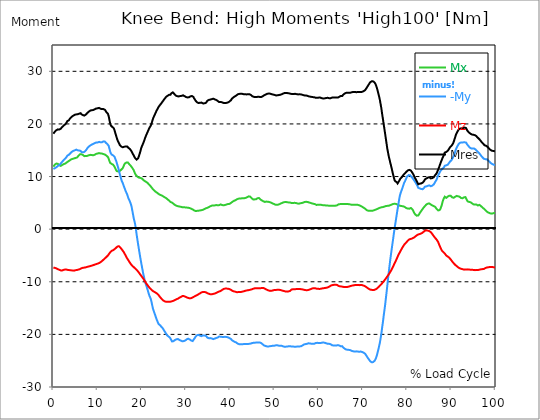
| Category |  Mx |  -My |  Mz |  Mres |
|---|---|---|---|---|
| 0.0 | 11.876 | 11.443 | -7.324 | 18.142 |
| 0.167348456675344 | 12.068 | 11.507 | -7.34 | 18.334 |
| 0.334696913350688 | 12.26 | 11.587 | -7.356 | 18.527 |
| 0.5020453700260321 | 12.389 | 11.667 | -7.388 | 18.671 |
| 0.669393826701376 | 12.469 | 11.763 | -7.452 | 18.799 |
| 0.83674228337672 | 12.469 | 11.876 | -7.532 | 18.895 |
| 1.0040907400520642 | 12.421 | 12.004 | -7.597 | 18.959 |
| 1.1621420602454444 | 12.308 | 12.1 | -7.661 | 18.959 |
| 1.3294905169207885 | 12.164 | 12.164 | -7.725 | 18.927 |
| 1.4968389735961325 | 12.02 | 12.292 | -7.789 | 18.943 |
| 1.6641874302714765 | 12.02 | 12.485 | -7.837 | 19.088 |
| 1.8315358869468206 | 12.132 | 12.629 | -7.853 | 19.248 |
| 1.9988843436221646 | 12.212 | 12.805 | -7.837 | 19.424 |
| 2.1662328002975086 | 12.292 | 12.965 | -7.805 | 19.552 |
| 2.333581256972853 | 12.356 | 13.142 | -7.741 | 19.697 |
| 2.5009297136481967 | 12.421 | 13.302 | -7.725 | 19.825 |
| 2.6682781703235405 | 12.453 | 13.414 | -7.661 | 19.921 |
| 2.8356266269988843 | 12.485 | 13.51 | -7.645 | 20.001 |
| 3.002975083674229 | 12.661 | 13.735 | -7.693 | 20.258 |
| 3.1703235403495724 | 12.837 | 13.975 | -7.725 | 20.546 |
| 3.337671997024917 | 12.869 | 14.087 | -7.757 | 20.658 |
| 3.4957233172182973 | 12.869 | 14.135 | -7.773 | 20.69 |
| 3.663071773893641 | 13.046 | 14.28 | -7.789 | 20.915 |
| 3.8304202305689854 | 13.174 | 14.424 | -7.821 | 21.107 |
| 3.997768687244329 | 13.254 | 14.552 | -7.821 | 21.235 |
| 4.165117143919673 | 13.302 | 14.696 | -7.853 | 21.379 |
| 4.332465600595017 | 13.35 | 14.792 | -7.869 | 21.492 |
| 4.499814057270361 | 13.382 | 14.873 | -7.885 | 21.572 |
| 4.667162513945706 | 13.446 | 14.937 | -7.885 | 21.652 |
| 4.834510970621049 | 13.526 | 14.985 | -7.853 | 21.732 |
| 5.001859427296393 | 13.526 | 15.065 | -7.805 | 21.764 |
| 5.169207883971737 | 13.558 | 15.113 | -7.789 | 21.812 |
| 5.336556340647081 | 13.607 | 15.033 | -7.757 | 21.78 |
| 5.503904797322425 | 13.767 | 14.985 | -7.725 | 21.828 |
| 5.671253253997769 | 13.927 | 14.953 | -7.677 | 21.892 |
| 5.82930457419115 | 14.055 | 14.953 | -7.645 | 21.956 |
| 5.996653030866494 | 14.216 | 14.937 | -7.597 | 22.053 |
| 6.164001487541838 | 14.296 | 14.873 | -7.532 | 22.036 |
| 6.331349944217181 | 14.232 | 14.68 | -7.436 | 21.844 |
| 6.498698400892526 | 14.183 | 14.584 | -7.372 | 21.716 |
| 6.66604685756787 | 14.103 | 14.6 | -7.34 | 21.684 |
| 6.833395314243213 | 13.959 | 14.616 | -7.308 | 21.588 |
| 7.000743770918558 | 13.879 | 14.68 | -7.308 | 21.588 |
| 7.168092227593902 | 13.863 | 14.792 | -7.292 | 21.652 |
| 7.335440684269246 | 13.895 | 14.953 | -7.26 | 21.764 |
| 7.50278914094459 | 13.879 | 15.145 | -7.228 | 21.876 |
| 7.6701375976199335 | 13.927 | 15.369 | -7.164 | 22.069 |
| 7.837486054295278 | 13.975 | 15.53 | -7.116 | 22.181 |
| 7.995537374488658 | 14.039 | 15.69 | -7.1 | 22.325 |
| 8.162885831164003 | 14.103 | 15.818 | -7.068 | 22.469 |
| 8.330234287839346 | 14.119 | 15.898 | -7.02 | 22.533 |
| 8.49758274451469 | 14.103 | 15.978 | -6.988 | 22.565 |
| 8.664931201190035 | 14.103 | 16.075 | -6.939 | 22.613 |
| 8.832279657865378 | 14.071 | 16.139 | -6.891 | 22.645 |
| 8.999628114540721 | 14.039 | 16.187 | -6.843 | 22.629 |
| 9.166976571216066 | 14.071 | 16.251 | -6.811 | 22.694 |
| 9.334325027891412 | 14.135 | 16.347 | -6.747 | 22.774 |
| 9.501673484566755 | 14.216 | 16.411 | -6.683 | 22.854 |
| 9.669021941242098 | 14.312 | 16.459 | -6.651 | 22.934 |
| 9.836370397917442 | 14.36 | 16.491 | -6.603 | 22.982 |
| 10.003718854592787 | 14.376 | 16.475 | -6.555 | 22.966 |
| 10.17106731126813 | 14.424 | 16.523 | -6.507 | 22.998 |
| 10.329118631461512 | 14.456 | 16.587 | -6.443 | 23.046 |
| 10.496467088136853 | 14.44 | 16.603 | -6.347 | 23.014 |
| 10.663815544812199 | 14.392 | 16.507 | -6.282 | 22.886 |
| 10.831164001487544 | 14.376 | 16.475 | -6.202 | 22.838 |
| 10.998512458162887 | 14.36 | 16.523 | -6.058 | 22.822 |
| 11.16586091483823 | 14.344 | 16.571 | -5.962 | 22.806 |
| 11.333209371513574 | 14.264 | 16.684 | -5.802 | 22.822 |
| 11.50055782818892 | 14.183 | 16.748 | -5.625 | 22.774 |
| 11.667906284864264 | 14.167 | 16.636 | -5.545 | 22.678 |
| 11.835254741539607 | 14.055 | 16.443 | -5.417 | 22.453 |
| 12.00260319821495 | 13.975 | 16.267 | -5.289 | 22.229 |
| 12.169951654890292 | 13.879 | 16.203 | -5.161 | 22.117 |
| 12.337300111565641 | 13.719 | 16.123 | -5 | 21.924 |
| 12.504648568240984 | 13.398 | 15.85 | -4.808 | 21.492 |
| 12.662699888434362 | 12.981 | 15.321 | -4.616 | 20.802 |
| 12.830048345109708 | 12.597 | 14.792 | -4.423 | 20.129 |
| 12.997396801785053 | 12.437 | 14.392 | -4.247 | 19.697 |
| 13.164745258460396 | 12.405 | 14.183 | -4.119 | 19.52 |
| 13.33209371513574 | 12.34 | 14.119 | -4.055 | 19.424 |
| 13.499442171811083 | 12.26 | 14.023 | -4.007 | 19.296 |
| 13.666790628486426 | 12.116 | 14.007 | -3.91 | 19.168 |
| 13.834139085161771 | 11.86 | 13.751 | -3.798 | 18.783 |
| 14.001487541837117 | 11.555 | 13.382 | -3.686 | 18.286 |
| 14.16883599851246 | 11.251 | 13.03 | -3.558 | 17.822 |
| 14.336184455187803 | 11.042 | 12.597 | -3.43 | 17.357 |
| 14.503532911863147 | 10.93 | 12.116 | -3.285 | 16.924 |
| 14.670881368538492 | 10.962 | 11.651 | -3.237 | 16.62 |
| 14.828932688731873 | 11.042 | 11.122 | -3.253 | 16.347 |
| 14.996281145407215 | 11.042 | 10.545 | -3.382 | 16.027 |
| 15.163629602082558 | 11.154 | 10.017 | -3.526 | 15.85 |
| 15.330978058757903 | 11.299 | 9.504 | -3.686 | 15.706 |
| 15.498326515433247 | 11.427 | 9.087 | -3.878 | 15.594 |
| 15.665674972108594 | 11.571 | 8.799 | -4.071 | 15.562 |
| 15.833023428783937 | 11.876 | 8.414 | -4.263 | 15.626 |
| 16.00037188545928 | 12.228 | 8.013 | -4.471 | 15.658 |
| 16.167720342134626 | 12.469 | 7.661 | -4.744 | 15.722 |
| 16.335068798809967 | 12.613 | 7.244 | -5 | 15.722 |
| 16.502417255485312 | 12.661 | 7.1 | -5.289 | 15.802 |
| 16.669765712160658 | 12.693 | 6.667 | -5.529 | 15.722 |
| 16.837114168836 | 12.677 | 6.202 | -5.754 | 15.594 |
| 17.004462625511344 | 12.533 | 5.786 | -5.962 | 15.434 |
| 17.16251394570472 | 12.34 | 5.545 | -6.202 | 15.321 |
| 17.32986240238007 | 12.228 | 5.193 | -6.411 | 15.209 |
| 17.497210859055414 | 12.036 | 4.808 | -6.603 | 15.001 |
| 17.664559315730756 | 11.844 | 4.359 | -6.795 | 14.792 |
| 17.8319077724061 | 11.651 | 3.606 | -6.939 | 14.52 |
| 17.999256229081443 | 11.443 | 2.869 | -7.084 | 14.264 |
| 18.166604685756788 | 11.203 | 2.083 | -7.212 | 14.023 |
| 18.333953142432133 | 10.85 | 1.523 | -7.34 | 13.751 |
| 18.501301599107478 | 10.513 | 0.881 | -7.468 | 13.478 |
| 18.668650055782823 | 10.289 | -0.016 | -7.597 | 13.318 |
| 18.835998512458165 | 10.129 | -1.058 | -7.741 | 13.222 |
| 19.00334696913351 | 9.985 | -1.987 | -7.901 | 13.286 |
| 19.170695425808855 | 9.856 | -2.901 | -8.077 | 13.478 |
| 19.338043882484197 | 9.792 | -3.766 | -8.254 | 13.847 |
| 19.496095202677576 | 9.776 | -4.632 | -8.446 | 14.296 |
| 19.66344365935292 | 9.744 | -5.465 | -8.638 | 14.776 |
| 19.830792116028263 | 9.696 | -6.266 | -8.815 | 15.321 |
| 19.998140572703612 | 9.632 | -7.036 | -9.023 | 15.706 |
| 20.165489029378953 | 9.504 | -7.773 | -9.215 | 16.043 |
| 20.3328374860543 | 9.359 | -8.526 | -9.408 | 16.363 |
| 20.500185942729644 | 9.231 | -9.119 | -9.632 | 16.732 |
| 20.667534399404985 | 9.135 | -9.824 | -9.856 | 17.148 |
| 20.83488285608033 | 9.039 | -10.305 | -10.097 | 17.533 |
| 21.002231312755672 | 8.975 | -10.69 | -10.305 | 17.87 |
| 21.16957976943102 | 8.879 | -11.138 | -10.497 | 18.206 |
| 21.336928226106362 | 8.75 | -11.587 | -10.69 | 18.511 |
| 21.504276682781704 | 8.606 | -12.068 | -10.882 | 18.831 |
| 21.67162513945705 | 8.462 | -12.549 | -11.058 | 19.168 |
| 21.82967645965043 | 8.302 | -12.885 | -11.235 | 19.408 |
| 21.997024916325774 | 8.141 | -13.19 | -11.395 | 19.633 |
| 22.16437337300112 | 7.949 | -13.735 | -11.507 | 19.985 |
| 22.33172182967646 | 7.805 | -14.392 | -11.619 | 20.45 |
| 22.499070286351806 | 7.613 | -15.049 | -11.747 | 20.931 |
| 22.666418743027148 | 7.452 | -15.498 | -11.844 | 21.283 |
| 22.833767199702496 | 7.324 | -15.898 | -11.924 | 21.588 |
| 23.00111565637784 | 7.196 | -16.283 | -12.02 | 21.892 |
| 23.168464113053183 | 7.084 | -16.716 | -12.084 | 22.213 |
| 23.335812569728528 | 6.972 | -17.116 | -12.164 | 22.517 |
| 23.50316102640387 | 6.891 | -17.453 | -12.276 | 22.758 |
| 23.670509483079215 | 6.779 | -17.822 | -12.405 | 23.046 |
| 23.83785793975456 | 6.667 | -18.062 | -12.581 | 23.287 |
| 23.995909259947936 | 6.587 | -18.222 | -12.757 | 23.479 |
| 24.163257716623285 | 6.507 | -18.286 | -12.949 | 23.607 |
| 24.330606173298627 | 6.491 | -18.479 | -13.11 | 23.831 |
| 24.49795462997397 | 6.411 | -18.623 | -13.27 | 24.024 |
| 24.665303086649313 | 6.314 | -18.767 | -13.414 | 24.2 |
| 24.83265154332466 | 6.234 | -18.975 | -13.542 | 24.408 |
| 25.0 | 6.138 | -19.216 | -13.639 | 24.601 |
| 25.167348456675345 | 6.058 | -19.44 | -13.719 | 24.793 |
| 25.334696913350694 | 5.978 | -19.649 | -13.767 | 24.969 |
| 25.502045370026035 | 5.898 | -19.889 | -13.799 | 25.146 |
| 25.669393826701377 | 5.77 | -20.129 | -13.815 | 25.306 |
| 25.836742283376722 | 5.657 | -20.242 | -13.799 | 25.354 |
| 26.004090740052067 | 5.545 | -20.386 | -13.799 | 25.45 |
| 26.17143919672741 | 5.433 | -20.53 | -13.815 | 25.53 |
| 26.329490516920792 | 5.289 | -20.594 | -13.799 | 25.53 |
| 26.49683897359613 | 5.161 | -20.706 | -13.783 | 25.562 |
| 26.66418743027148 | 5.112 | -21.075 | -13.751 | 25.819 |
| 26.831535886946828 | 5.048 | -21.347 | -13.703 | 25.995 |
| 26.998884343622166 | 4.936 | -21.411 | -13.671 | 25.995 |
| 27.166232800297514 | 4.824 | -21.283 | -13.607 | 25.835 |
| 27.333581256972852 | 4.696 | -21.219 | -13.51 | 25.707 |
| 27.5009297136482 | 4.584 | -21.059 | -13.462 | 25.53 |
| 27.668278170323543 | 4.487 | -20.963 | -13.398 | 25.402 |
| 27.835626626998888 | 4.455 | -20.931 | -13.318 | 25.322 |
| 28.002975083674233 | 4.391 | -20.915 | -13.27 | 25.274 |
| 28.170323540349575 | 4.359 | -20.883 | -13.206 | 25.21 |
| 28.33767199702492 | 4.327 | -20.947 | -13.142 | 25.226 |
| 28.50502045370026 | 4.295 | -21.059 | -13.03 | 25.274 |
| 28.663071773893645 | 4.279 | -21.123 | -12.965 | 25.29 |
| 28.830420230568986 | 4.247 | -21.187 | -12.885 | 25.29 |
| 28.99776868724433 | 4.199 | -21.283 | -12.789 | 25.338 |
| 29.165117143919673 | 4.167 | -21.315 | -12.725 | 25.338 |
| 29.33246560059502 | 4.183 | -21.427 | -12.725 | 25.434 |
| 29.499814057270367 | 4.151 | -21.267 | -12.725 | 25.274 |
| 29.66716251394571 | 4.151 | -21.251 | -12.773 | 25.274 |
| 29.834510970621054 | 4.135 | -21.155 | -12.837 | 25.21 |
| 30.00185942729639 | 4.119 | -21.027 | -12.917 | 25.114 |
| 30.169207883971744 | 4.103 | -20.931 | -12.965 | 25.066 |
| 30.33655634064708 | 4.071 | -20.883 | -13.014 | 25.033 |
| 30.50390479732243 | 4.071 | -20.818 | -13.078 | 25.017 |
| 30.671253253997772 | 4.071 | -20.834 | -13.142 | 25.066 |
| 30.829304574191156 | 4.007 | -20.963 | -13.158 | 25.162 |
| 30.996653030866494 | 3.943 | -21.075 | -13.142 | 25.242 |
| 31.164001487541842 | 3.878 | -21.171 | -13.11 | 25.306 |
| 31.331349944217187 | 3.83 | -21.219 | -13.046 | 25.306 |
| 31.498698400892525 | 3.75 | -21.267 | -12.965 | 25.29 |
| 31.666046857567874 | 3.638 | -21.155 | -12.885 | 25.13 |
| 31.833395314243212 | 3.558 | -20.851 | -12.821 | 24.841 |
| 32.00074377091856 | 3.478 | -20.658 | -12.741 | 24.633 |
| 32.1680922275939 | 3.446 | -20.418 | -12.677 | 24.408 |
| 32.33544068426925 | 3.462 | -20.258 | -12.597 | 24.232 |
| 32.50278914094459 | 3.478 | -20.145 | -12.533 | 24.104 |
| 32.670137597619934 | 3.494 | -20.097 | -12.437 | 24.024 |
| 32.83748605429528 | 3.51 | -20.097 | -12.356 | 23.976 |
| 33.004834510970625 | 3.526 | -20.129 | -12.292 | 23.976 |
| 33.162885831164004 | 3.558 | -20.242 | -12.196 | 24.024 |
| 33.33023428783935 | 3.59 | -20.338 | -12.084 | 24.088 |
| 33.497582744514695 | 3.606 | -20.338 | -12.02 | 24.056 |
| 33.664931201190036 | 3.638 | -20.274 | -11.972 | 23.976 |
| 33.83227965786538 | 3.686 | -20.193 | -11.94 | 23.896 |
| 33.99962811454073 | 3.75 | -20.209 | -11.924 | 23.896 |
| 34.16697657121607 | 3.83 | -20.225 | -11.94 | 23.912 |
| 34.33432502789141 | 3.894 | -20.258 | -11.972 | 23.96 |
| 34.50167348456676 | 3.975 | -20.274 | -12.004 | 24.008 |
| 34.6690219412421 | 4.039 | -20.386 | -12.084 | 24.168 |
| 34.83637039791744 | 4.055 | -20.626 | -12.18 | 24.408 |
| 35.00371885459279 | 4.135 | -20.674 | -12.228 | 24.505 |
| 35.17106731126814 | 4.199 | -20.722 | -12.276 | 24.569 |
| 35.338415767943474 | 4.263 | -20.722 | -12.34 | 24.617 |
| 35.49646708813686 | 4.359 | -20.706 | -12.389 | 24.633 |
| 35.6638155448122 | 4.423 | -20.706 | -12.389 | 24.649 |
| 35.831164001487544 | 4.471 | -20.786 | -12.372 | 24.713 |
| 35.998512458162885 | 4.487 | -20.867 | -12.34 | 24.761 |
| 36.165860914838234 | 4.487 | -20.899 | -12.308 | 24.793 |
| 36.333209371513576 | 4.519 | -20.851 | -12.276 | 24.729 |
| 36.50055782818892 | 4.519 | -20.786 | -12.228 | 24.665 |
| 36.667906284864266 | 4.584 | -20.706 | -12.18 | 24.601 |
| 36.83525474153961 | 4.584 | -20.69 | -12.116 | 24.553 |
| 37.002603198214956 | 4.552 | -20.706 | -12.036 | 24.505 |
| 37.1699516548903 | 4.519 | -20.594 | -11.956 | 24.36 |
| 37.337300111565646 | 4.552 | -20.466 | -11.908 | 24.248 |
| 37.50464856824098 | 4.568 | -20.402 | -11.844 | 24.152 |
| 37.66269988843437 | 4.632 | -20.418 | -11.796 | 24.152 |
| 37.83004834510971 | 4.696 | -20.45 | -11.747 | 24.184 |
| 37.99739680178505 | 4.664 | -20.498 | -11.667 | 24.168 |
| 38.16474525846039 | 4.584 | -20.482 | -11.539 | 24.088 |
| 38.33209371513574 | 4.552 | -20.482 | -11.427 | 24.024 |
| 38.49944217181109 | 4.536 | -20.482 | -11.363 | 23.992 |
| 38.666790628486424 | 4.568 | -20.466 | -11.331 | 23.96 |
| 38.83413908516178 | 4.6 | -20.466 | -11.299 | 23.96 |
| 39.001487541837115 | 4.632 | -20.466 | -11.299 | 23.976 |
| 39.16883599851246 | 4.696 | -20.498 | -11.299 | 24.008 |
| 39.336184455187805 | 4.728 | -20.53 | -11.299 | 24.04 |
| 39.503532911863154 | 4.776 | -20.562 | -11.315 | 24.088 |
| 39.670881368538495 | 4.808 | -20.658 | -11.347 | 24.184 |
| 39.83822982521384 | 4.808 | -20.722 | -11.395 | 24.264 |
| 39.996281145407224 | 4.904 | -20.754 | -11.459 | 24.344 |
| 40.163629602082565 | 5 | -20.883 | -11.539 | 24.521 |
| 40.33097805875791 | 5.112 | -21.075 | -11.651 | 24.761 |
| 40.498326515433256 | 5.209 | -21.203 | -11.731 | 24.921 |
| 40.6656749721086 | 5.289 | -21.267 | -11.796 | 25.017 |
| 40.83302342878393 | 5.385 | -21.363 | -11.828 | 25.146 |
| 41.00037188545929 | 5.465 | -21.411 | -11.86 | 25.21 |
| 41.16772034213463 | 5.497 | -21.476 | -11.892 | 25.29 |
| 41.33506879880997 | 5.561 | -21.54 | -11.956 | 25.386 |
| 41.50241725548531 | 5.673 | -21.604 | -11.988 | 25.466 |
| 41.66976571216066 | 5.721 | -21.748 | -11.972 | 25.61 |
| 41.837114168836 | 5.786 | -21.828 | -11.956 | 25.675 |
| 42.004462625511344 | 5.834 | -21.86 | -11.94 | 25.707 |
| 42.17181108218669 | 5.85 | -21.876 | -11.94 | 25.723 |
| 42.32986240238007 | 5.85 | -21.876 | -11.924 | 25.723 |
| 42.497210859055414 | 5.85 | -21.876 | -11.924 | 25.723 |
| 42.66455931573076 | 5.866 | -21.876 | -11.892 | 25.723 |
| 42.831907772406105 | 5.882 | -21.892 | -11.86 | 25.707 |
| 42.999256229081446 | 5.898 | -21.844 | -11.828 | 25.658 |
| 43.16660468575679 | 5.882 | -21.844 | -11.78 | 25.658 |
| 43.33395314243214 | 5.914 | -21.844 | -11.715 | 25.626 |
| 43.50130159910748 | 5.946 | -21.812 | -11.683 | 25.594 |
| 43.66865005578282 | 5.978 | -21.812 | -11.651 | 25.61 |
| 43.83599851245817 | 6.09 | -21.812 | -11.635 | 25.626 |
| 44.00334696913351 | 6.202 | -21.812 | -11.603 | 25.658 |
| 44.17069542580886 | 6.234 | -21.796 | -11.587 | 25.658 |
| 44.3380438824842 | 6.234 | -21.796 | -11.571 | 25.642 |
| 44.49609520267758 | 6.186 | -21.796 | -11.523 | 25.61 |
| 44.66344365935292 | 6.026 | -21.732 | -11.491 | 25.498 |
| 44.83079211602827 | 5.882 | -21.684 | -11.443 | 25.37 |
| 44.99814057270361 | 5.737 | -21.636 | -11.395 | 25.258 |
| 45.16548902937895 | 5.657 | -21.604 | -11.331 | 25.194 |
| 45.332837486054295 | 5.657 | -21.588 | -11.283 | 25.146 |
| 45.500185942729644 | 5.657 | -21.572 | -11.251 | 25.114 |
| 45.66753439940499 | 5.657 | -21.572 | -11.235 | 25.114 |
| 45.83488285608033 | 5.689 | -21.556 | -11.219 | 25.098 |
| 46.00223131275568 | 5.802 | -21.524 | -11.235 | 25.114 |
| 46.16957976943102 | 5.882 | -21.524 | -11.219 | 25.146 |
| 46.336928226106366 | 5.946 | -21.524 | -11.235 | 25.178 |
| 46.50427668278171 | 5.914 | -21.54 | -11.235 | 25.178 |
| 46.671625139457056 | 5.786 | -21.54 | -11.235 | 25.13 |
| 46.829676459650436 | 5.625 | -21.54 | -11.219 | 25.066 |
| 46.99702491632577 | 5.513 | -21.652 | -11.187 | 25.114 |
| 47.16437337300112 | 5.449 | -21.764 | -11.187 | 25.178 |
| 47.33172182967646 | 5.369 | -21.892 | -11.17 | 25.258 |
| 47.49907028635181 | 5.289 | -22.004 | -11.187 | 25.338 |
| 47.66641874302716 | 5.241 | -22.117 | -11.235 | 25.45 |
| 47.83376719970249 | 5.177 | -22.165 | -11.315 | 25.498 |
| 48.001115656377834 | 5.209 | -22.213 | -11.395 | 25.578 |
| 48.16846411305319 | 5.241 | -22.245 | -11.475 | 25.658 |
| 48.33581256972853 | 5.241 | -22.293 | -11.539 | 25.723 |
| 48.50316102640387 | 5.209 | -22.309 | -11.603 | 25.755 |
| 48.67050948307921 | 5.209 | -22.293 | -11.683 | 25.771 |
| 48.837857939754564 | 5.161 | -22.261 | -11.699 | 25.755 |
| 49.005206396429905 | 5.128 | -22.245 | -11.731 | 25.755 |
| 49.163257716623285 | 5.064 | -22.229 | -11.731 | 25.723 |
| 49.33060617329863 | 4.984 | -22.197 | -11.715 | 25.658 |
| 49.49795462997397 | 4.92 | -22.181 | -11.683 | 25.626 |
| 49.66530308664932 | 4.84 | -22.165 | -11.635 | 25.578 |
| 49.832651543324666 | 4.792 | -22.181 | -11.587 | 25.562 |
| 50.0 | 4.712 | -22.149 | -11.571 | 25.514 |
| 50.16734845667534 | 4.664 | -22.101 | -11.555 | 25.45 |
| 50.33469691335069 | 4.632 | -22.069 | -11.539 | 25.418 |
| 50.50204537002604 | 4.632 | -22.069 | -11.539 | 25.402 |
| 50.66939382670139 | 4.632 | -22.085 | -11.539 | 25.434 |
| 50.836742283376715 | 4.664 | -22.085 | -11.539 | 25.45 |
| 51.00409074005207 | 4.712 | -22.149 | -11.539 | 25.498 |
| 51.17143919672741 | 4.76 | -22.149 | -11.539 | 25.53 |
| 51.32949051692079 | 4.84 | -22.149 | -11.571 | 25.546 |
| 51.496838973596134 | 4.904 | -22.165 | -11.603 | 25.594 |
| 51.66418743027148 | 4.984 | -22.181 | -11.651 | 25.642 |
| 51.831535886946824 | 5.032 | -22.229 | -11.699 | 25.707 |
| 51.99888434362217 | 5.08 | -22.293 | -11.731 | 25.787 |
| 52.16623280029752 | 5.128 | -22.357 | -11.763 | 25.867 |
| 52.33358125697285 | 5.145 | -22.357 | -11.812 | 25.899 |
| 52.5009297136482 | 5.161 | -22.341 | -11.844 | 25.899 |
| 52.668278170323546 | 5.145 | -22.325 | -11.876 | 25.899 |
| 52.835626626998895 | 5.128 | -22.325 | -11.876 | 25.899 |
| 53.00297508367424 | 5.112 | -22.293 | -11.86 | 25.851 |
| 53.17032354034958 | 5.08 | -22.245 | -11.828 | 25.803 |
| 53.33767199702492 | 5.08 | -22.245 | -11.812 | 25.803 |
| 53.50502045370027 | 5.064 | -22.261 | -11.747 | 25.787 |
| 53.663071773893655 | 5 | -22.277 | -11.603 | 25.723 |
| 53.83042023056899 | 4.968 | -22.293 | -11.475 | 25.691 |
| 53.99776868724433 | 4.968 | -22.309 | -11.443 | 25.691 |
| 54.16511714391967 | 4.968 | -22.309 | -11.427 | 25.675 |
| 54.33246560059503 | 4.984 | -22.325 | -11.427 | 25.691 |
| 54.49981405727037 | 5 | -22.357 | -11.427 | 25.723 |
| 54.667162513945705 | 5.016 | -22.357 | -11.411 | 25.723 |
| 54.834510970621054 | 4.984 | -22.341 | -11.395 | 25.691 |
| 55.0018594272964 | 4.936 | -22.325 | -11.379 | 25.658 |
| 55.169207883971744 | 4.888 | -22.309 | -11.379 | 25.626 |
| 55.336556340647086 | 4.856 | -22.293 | -11.379 | 25.61 |
| 55.50390479732243 | 4.84 | -22.325 | -11.379 | 25.626 |
| 55.671253253997776 | 4.872 | -22.293 | -11.395 | 25.626 |
| 55.83860171067312 | 4.92 | -22.293 | -11.395 | 25.626 |
| 55.9966530308665 | 4.936 | -22.245 | -11.395 | 25.61 |
| 56.16400148754184 | 4.968 | -22.181 | -11.411 | 25.562 |
| 56.33134994421718 | 5 | -22.101 | -11.443 | 25.53 |
| 56.498698400892536 | 5.048 | -22.02 | -11.491 | 25.482 |
| 56.66604685756788 | 5.112 | -21.924 | -11.523 | 25.434 |
| 56.83339531424321 | 5.177 | -21.876 | -11.555 | 25.402 |
| 57.00074377091856 | 5.193 | -21.844 | -11.571 | 25.402 |
| 57.16809222759391 | 5.193 | -21.828 | -11.603 | 25.402 |
| 57.33544068426925 | 5.177 | -21.796 | -11.603 | 25.37 |
| 57.5027891409446 | 5.161 | -21.748 | -11.587 | 25.322 |
| 57.670137597619934 | 5.145 | -21.7 | -11.539 | 25.258 |
| 57.83748605429528 | 5.064 | -21.716 | -11.507 | 25.226 |
| 58.004834510970625 | 5.032 | -21.716 | -11.459 | 25.194 |
| 58.16288583116401 | 4.984 | -21.748 | -11.395 | 25.178 |
| 58.330234287839346 | 4.92 | -21.78 | -11.331 | 25.146 |
| 58.497582744514695 | 4.888 | -21.78 | -11.283 | 25.114 |
| 58.66493120119004 | 4.872 | -21.78 | -11.251 | 25.098 |
| 58.832279657865385 | 4.824 | -21.796 | -11.219 | 25.082 |
| 58.999628114540734 | 4.808 | -21.78 | -11.203 | 25.066 |
| 59.16697657121607 | 4.744 | -21.7 | -11.219 | 25.001 |
| 59.33432502789142 | 4.712 | -21.636 | -11.251 | 24.953 |
| 59.50167348456676 | 4.6 | -21.572 | -11.315 | 24.921 |
| 59.66902194124211 | 4.616 | -21.604 | -11.331 | 24.953 |
| 59.83637039791745 | 4.648 | -21.636 | -11.331 | 24.985 |
| 60.00371885459278 | 4.648 | -21.652 | -11.347 | 25.001 |
| 60.17106731126813 | 4.648 | -21.652 | -11.363 | 25.001 |
| 60.33841576794349 | 4.632 | -21.652 | -11.347 | 25.001 |
| 60.49646708813685 | 4.632 | -21.636 | -11.331 | 24.969 |
| 60.6638155448122 | 4.584 | -21.588 | -11.299 | 24.905 |
| 60.831164001487544 | 4.568 | -21.572 | -11.251 | 24.857 |
| 60.99851245816289 | 4.552 | -21.54 | -11.235 | 24.825 |
| 61.16586091483824 | 4.552 | -21.524 | -11.219 | 24.809 |
| 61.333209371513576 | 4.536 | -21.588 | -11.187 | 24.857 |
| 61.50055782818892 | 4.519 | -21.652 | -11.17 | 24.905 |
| 61.667906284864266 | 4.519 | -21.684 | -11.154 | 24.921 |
| 61.835254741539615 | 4.503 | -21.716 | -11.122 | 24.921 |
| 62.002603198214956 | 4.503 | -21.78 | -11.074 | 24.969 |
| 62.16995165489029 | 4.471 | -21.796 | -11.01 | 24.937 |
| 62.33730011156564 | 4.455 | -21.78 | -10.946 | 24.889 |
| 62.504648568240995 | 4.439 | -21.796 | -10.866 | 24.857 |
| 62.67199702491633 | 4.439 | -21.86 | -10.802 | 24.889 |
| 62.83004834510971 | 4.471 | -22.02 | -10.69 | 24.985 |
| 62.99739680178505 | 4.471 | -22.069 | -10.642 | 25.001 |
| 63.1647452584604 | 4.455 | -22.085 | -10.626 | 24.985 |
| 63.33209371513575 | 4.455 | -22.101 | -10.594 | 25.001 |
| 63.4994421718111 | 4.439 | -22.149 | -10.561 | 25.017 |
| 63.666790628486424 | 4.439 | -22.133 | -10.561 | 25.017 |
| 63.83413908516177 | 4.471 | -22.117 | -10.561 | 25.001 |
| 64.00148754183712 | 4.487 | -22.117 | -10.578 | 25.017 |
| 64.16883599851248 | 4.536 | -22.085 | -10.61 | 25.001 |
| 64.3361844551878 | 4.632 | -22.036 | -10.69 | 25.017 |
| 64.50353291186315 | 4.728 | -22.053 | -10.802 | 25.082 |
| 64.6708813685385 | 4.744 | -22.117 | -10.85 | 25.162 |
| 64.83822982521384 | 4.76 | -22.213 | -10.866 | 25.258 |
| 65.00557828188919 | 4.76 | -22.277 | -10.882 | 25.322 |
| 65.16362960208257 | 4.76 | -22.261 | -10.898 | 25.322 |
| 65.3309780587579 | 4.776 | -22.261 | -10.914 | 25.322 |
| 65.49832651543326 | 4.776 | -22.469 | -10.962 | 25.53 |
| 65.6656749721086 | 4.76 | -22.613 | -11.01 | 25.675 |
| 65.83302342878395 | 4.776 | -22.694 | -11.01 | 25.755 |
| 66.00037188545929 | 4.808 | -22.79 | -11.026 | 25.851 |
| 66.16772034213463 | 4.792 | -22.87 | -11.01 | 25.899 |
| 66.33506879880998 | 4.792 | -22.902 | -10.994 | 25.931 |
| 66.50241725548531 | 4.776 | -22.918 | -10.978 | 25.947 |
| 66.66976571216065 | 4.776 | -22.934 | -10.946 | 25.947 |
| 66.83711416883601 | 4.744 | -22.95 | -10.914 | 25.947 |
| 67.00446262551135 | 4.712 | -22.966 | -10.866 | 25.931 |
| 67.1718110821867 | 4.696 | -22.998 | -10.818 | 25.931 |
| 67.32986240238007 | 4.664 | -23.078 | -10.786 | 25.979 |
| 67.49721085905541 | 4.616 | -23.142 | -10.738 | 26.027 |
| 67.66455931573076 | 4.616 | -23.19 | -10.722 | 26.043 |
| 67.83190777240611 | 4.632 | -23.222 | -10.69 | 26.075 |
| 67.99925622908145 | 4.648 | -23.255 | -10.658 | 26.091 |
| 68.16660468575678 | 4.616 | -23.271 | -10.626 | 26.075 |
| 68.33395314243214 | 4.616 | -23.255 | -10.626 | 26.059 |
| 68.50130159910749 | 4.616 | -23.222 | -10.61 | 26.027 |
| 68.66865005578282 | 4.6 | -23.222 | -10.61 | 26.027 |
| 68.83599851245816 | 4.616 | -23.271 | -10.626 | 26.075 |
| 69.00334696913352 | 4.584 | -23.271 | -10.626 | 26.075 |
| 69.17069542580886 | 4.536 | -23.287 | -10.642 | 26.091 |
| 69.3380438824842 | 4.503 | -23.287 | -10.626 | 26.091 |
| 69.50539233915956 | 4.407 | -23.271 | -10.594 | 26.043 |
| 69.66344365935292 | 4.327 | -23.303 | -10.61 | 26.059 |
| 69.83079211602826 | 4.247 | -23.351 | -10.642 | 26.107 |
| 69.99814057270362 | 4.167 | -23.415 | -10.674 | 26.155 |
| 70.16548902937896 | 4.071 | -23.479 | -10.738 | 26.235 |
| 70.33283748605429 | 3.975 | -23.575 | -10.802 | 26.316 |
| 70.50018594272964 | 3.878 | -23.687 | -10.866 | 26.428 |
| 70.667534399405 | 3.798 | -23.831 | -10.978 | 26.588 |
| 70.83488285608033 | 3.622 | -24.12 | -11.058 | 26.844 |
| 71.00223131275568 | 3.574 | -24.28 | -11.138 | 27.021 |
| 71.16957976943102 | 3.51 | -24.553 | -11.251 | 27.309 |
| 71.33692822610637 | 3.478 | -24.713 | -11.379 | 27.518 |
| 71.50427668278171 | 3.478 | -24.937 | -11.443 | 27.742 |
| 71.67162513945706 | 3.462 | -25.13 | -11.475 | 27.934 |
| 71.8389735961324 | 3.478 | -25.194 | -11.523 | 28.014 |
| 71.99702491632577 | 3.478 | -25.306 | -11.539 | 28.111 |
| 72.16437337300113 | 3.494 | -25.338 | -11.555 | 28.143 |
| 72.33172182967647 | 3.542 | -25.258 | -11.571 | 28.078 |
| 72.49907028635181 | 3.59 | -25.162 | -11.555 | 27.998 |
| 72.66641874302715 | 3.638 | -24.985 | -11.507 | 27.838 |
| 72.8337671997025 | 3.702 | -24.713 | -11.459 | 27.582 |
| 73.00111565637783 | 3.766 | -24.376 | -11.363 | 27.245 |
| 73.16846411305319 | 3.814 | -23.912 | -11.283 | 26.796 |
| 73.33581256972853 | 3.862 | -23.367 | -11.17 | 26.284 |
| 73.50316102640387 | 3.943 | -22.822 | -11.026 | 25.739 |
| 73.67050948307921 | 4.007 | -22.197 | -10.882 | 25.162 |
| 73.83785793975457 | 4.071 | -21.556 | -10.738 | 24.521 |
| 74.00520639642991 | 4.103 | -20.706 | -10.594 | 23.735 |
| 74.16325771662328 | 4.151 | -19.857 | -10.449 | 22.934 |
| 74.33060617329863 | 4.183 | -18.735 | -10.273 | 21.908 |
| 74.49795462997398 | 4.199 | -17.757 | -10.113 | 21.027 |
| 74.66530308664932 | 4.231 | -16.62 | -9.952 | 20.049 |
| 74.83265154332466 | 4.279 | -15.562 | -9.76 | 19.136 |
| 75.00000000000001 | 4.343 | -14.488 | -9.584 | 18.206 |
| 75.16734845667534 | 4.391 | -13.286 | -9.392 | 17.245 |
| 75.3346969133507 | 4.407 | -12.052 | -9.183 | 16.299 |
| 75.50204537002605 | 4.423 | -10.786 | -8.991 | 15.321 |
| 75.66939382670138 | 4.439 | -9.472 | -8.783 | 14.584 |
| 75.83674228337672 | 4.455 | -8.238 | -8.59 | 13.863 |
| 76.00409074005208 | 4.503 | -7.052 | -8.366 | 13.27 |
| 76.17143919672742 | 4.552 | -5.882 | -8.141 | 12.677 |
| 76.33878765340276 | 4.616 | -4.808 | -7.901 | 12.132 |
| 76.49683897359614 | 4.68 | -3.798 | -7.629 | 11.539 |
| 76.66418743027148 | 4.744 | -2.789 | -7.34 | 10.914 |
| 76.83153588694682 | 4.792 | -1.811 | -7.068 | 10.321 |
| 76.99888434362218 | 4.824 | -0.769 | -6.779 | 9.776 |
| 77.16623280029752 | 4.824 | 0.224 | -6.475 | 9.279 |
| 77.33358125697285 | 4.856 | 1.106 | -6.202 | 9.087 |
| 77.5009297136482 | 4.792 | 2.019 | -5.882 | 8.991 |
| 77.66827817032356 | 4.712 | 2.933 | -5.577 | 8.911 |
| 77.83562662699889 | 4.648 | 3.83 | -5.241 | 8.686 |
| 78.00297508367423 | 4.568 | 4.648 | -4.936 | 8.831 |
| 78.17032354034959 | 4.503 | 5.561 | -4.664 | 9.151 |
| 78.33767199702493 | 4.439 | 6.314 | -4.407 | 9.424 |
| 78.50502045370027 | 4.423 | 6.827 | -4.151 | 9.648 |
| 78.67236891037561 | 4.391 | 7.228 | -3.878 | 9.776 |
| 78.83042023056899 | 4.375 | 7.597 | -3.622 | 9.936 |
| 78.99776868724433 | 4.359 | 8.029 | -3.398 | 10.129 |
| 79.16511714391969 | 4.327 | 8.446 | -3.157 | 10.321 |
| 79.33246560059503 | 4.279 | 8.847 | -2.949 | 10.497 |
| 79.49981405727036 | 4.183 | 9.103 | -2.805 | 10.61 |
| 79.66716251394571 | 4.103 | 9.408 | -2.644 | 10.77 |
| 79.83451097062107 | 3.991 | 9.728 | -2.484 | 10.93 |
| 80.00185942729641 | 3.943 | 10.017 | -2.324 | 11.106 |
| 80.16920788397174 | 3.91 | 10.161 | -2.164 | 11.17 |
| 80.33655634064709 | 3.878 | 10.273 | -2.035 | 11.235 |
| 80.50390479732243 | 3.894 | 10.321 | -1.907 | 11.267 |
| 80.67125325399778 | 3.991 | 10.241 | -1.875 | 11.235 |
| 80.83860171067312 | 4.023 | 10.129 | -1.843 | 11.138 |
| 80.99665303086651 | 3.91 | 9.92 | -1.827 | 10.93 |
| 81.16400148754184 | 3.782 | 9.76 | -1.779 | 10.738 |
| 81.3313499442172 | 3.558 | 9.568 | -1.683 | 10.481 |
| 81.49869840089255 | 3.221 | 9.408 | -1.603 | 10.209 |
| 81.66604685756786 | 2.981 | 9.151 | -1.523 | 9.904 |
| 81.83339531424322 | 2.789 | 8.927 | -1.394 | 9.632 |
| 82.00074377091858 | 2.644 | 8.718 | -1.282 | 9.392 |
| 82.16809222759392 | 2.564 | 8.462 | -1.186 | 9.119 |
| 82.33544068426926 | 2.532 | 8.19 | -1.09 | 8.831 |
| 82.50278914094459 | 2.596 | 7.853 | -0.994 | 8.542 |
| 82.67013759761994 | 2.789 | 7.709 | -0.962 | 8.478 |
| 82.83748605429528 | 3.061 | 7.741 | -0.946 | 8.638 |
| 83.00483451097062 | 3.237 | 7.709 | -0.881 | 8.702 |
| 83.17218296764597 | 3.43 | 7.629 | -0.801 | 8.686 |
| 83.33023428783935 | 3.654 | 7.548 | -0.753 | 8.702 |
| 83.4975827445147 | 3.846 | 7.597 | -0.689 | 8.831 |
| 83.66493120119004 | 4.039 | 7.597 | -0.529 | 8.895 |
| 83.83227965786537 | 4.199 | 7.853 | -0.417 | 9.167 |
| 83.99962811454073 | 4.375 | 8.077 | -0.305 | 9.44 |
| 84.16697657121607 | 4.552 | 8.061 | -0.224 | 9.52 |
| 84.33432502789142 | 4.68 | 8.125 | -0.224 | 9.632 |
| 84.50167348456677 | 4.776 | 8.19 | -0.24 | 9.744 |
| 84.6690219412421 | 4.84 | 8.238 | -0.272 | 9.792 |
| 84.83637039791745 | 4.872 | 8.286 | -0.321 | 9.856 |
| 85.0037188545928 | 4.888 | 8.318 | -0.369 | 9.872 |
| 85.17106731126813 | 4.808 | 8.222 | -0.433 | 9.76 |
| 85.33841576794349 | 4.68 | 8.158 | -0.561 | 9.648 |
| 85.50576422461883 | 4.584 | 8.206 | -0.737 | 9.664 |
| 85.66381554481221 | 4.519 | 8.27 | -0.914 | 9.696 |
| 85.83116400148755 | 4.407 | 8.318 | -1.122 | 9.712 |
| 85.99851245816289 | 4.391 | 8.494 | -1.314 | 9.872 |
| 86.16586091483823 | 4.375 | 8.718 | -1.49 | 10.081 |
| 86.33320937151358 | 4.231 | 8.975 | -1.683 | 10.273 |
| 86.50055782818893 | 4.039 | 9.151 | -1.859 | 10.401 |
| 86.66790628486427 | 3.83 | 9.44 | -1.987 | 10.61 |
| 86.83525474153961 | 3.67 | 9.856 | -2.164 | 10.978 |
| 87.00260319821496 | 3.558 | 10.177 | -2.452 | 11.299 |
| 87.16995165489031 | 3.558 | 10.481 | -2.789 | 11.667 |
| 87.33730011156564 | 3.622 | 10.77 | -3.141 | 12.052 |
| 87.504648568241 | 3.83 | 11.026 | -3.462 | 12.453 |
| 87.67199702491634 | 4.199 | 11.235 | -3.782 | 12.837 |
| 87.83004834510972 | 4.6 | 11.363 | -4.055 | 13.174 |
| 87.99739680178506 | 5.177 | 11.507 | -4.231 | 13.558 |
| 88.1647452584604 | 5.609 | 11.619 | -4.343 | 13.847 |
| 88.33209371513574 | 5.93 | 11.763 | -4.471 | 14.167 |
| 88.49944217181108 | 6.17 | 12.052 | -4.616 | 14.552 |
| 88.66679062848644 | 6.09 | 12.18 | -4.824 | 14.696 |
| 88.83413908516178 | 5.946 | 12.132 | -5.016 | 14.664 |
| 89.00148754183712 | 6.122 | 12.084 | -5.112 | 14.712 |
| 89.16883599851246 | 6.186 | 12.244 | -5.193 | 14.889 |
| 89.33618445518782 | 6.25 | 12.405 | -5.305 | 15.065 |
| 89.50353291186315 | 6.347 | 12.613 | -5.433 | 15.305 |
| 89.6708813685385 | 6.379 | 12.821 | -5.577 | 15.546 |
| 89.83822982521386 | 6.347 | 12.965 | -5.737 | 15.706 |
| 90.00557828188919 | 6.202 | 13.094 | -5.93 | 15.818 |
| 90.16362960208257 | 6.058 | 13.318 | -6.106 | 15.994 |
| 90.3309780587579 | 5.882 | 13.591 | -6.298 | 16.219 |
| 90.49832651543326 | 5.962 | 13.879 | -6.475 | 16.555 |
| 90.66567497210859 | 6.09 | 14.264 | -6.619 | 16.988 |
| 90.83302342878395 | 6.138 | 14.68 | -6.779 | 17.405 |
| 91.00037188545929 | 6.266 | 15.129 | -6.891 | 17.886 |
| 91.16772034213463 | 6.314 | 15.45 | -7.004 | 18.222 |
| 91.33506879880998 | 6.298 | 15.722 | -7.116 | 18.495 |
| 91.50241725548533 | 6.25 | 15.978 | -7.228 | 18.735 |
| 91.66976571216065 | 6.202 | 16.219 | -7.34 | 18.959 |
| 91.83711416883601 | 6.17 | 16.379 | -7.436 | 19.104 |
| 92.00446262551137 | 6.042 | 16.427 | -7.484 | 19.136 |
| 92.1718110821867 | 5.93 | 16.475 | -7.532 | 19.168 |
| 92.33915953886203 | 5.786 | 16.491 | -7.565 | 19.152 |
| 92.49721085905541 | 5.866 | 16.491 | -7.613 | 19.184 |
| 92.66455931573077 | 5.962 | 16.491 | -7.645 | 19.232 |
| 92.83190777240611 | 6.042 | 16.507 | -7.677 | 19.28 |
| 92.99925622908145 | 6.09 | 16.507 | -7.693 | 19.312 |
| 93.1666046857568 | 6.09 | 16.475 | -7.709 | 19.296 |
| 93.33395314243214 | 5.914 | 16.443 | -7.661 | 19.2 |
| 93.50130159910749 | 5.529 | 16.171 | -7.645 | 18.879 |
| 93.66865005578283 | 5.289 | 15.994 | -7.645 | 18.655 |
| 93.83599851245818 | 5.177 | 15.818 | -7.661 | 18.495 |
| 94.00334696913353 | 5.177 | 15.658 | -7.677 | 18.35 |
| 94.17069542580886 | 5.177 | 15.498 | -7.677 | 18.238 |
| 94.3380438824842 | 5.112 | 15.402 | -7.709 | 18.126 |
| 94.50539233915954 | 5.016 | 15.337 | -7.709 | 18.046 |
| 94.66344365935292 | 4.904 | 15.305 | -7.709 | 17.982 |
| 94.83079211602828 | 4.776 | 15.305 | -7.725 | 17.934 |
| 94.99814057270362 | 4.712 | 15.305 | -7.757 | 17.934 |
| 95.16548902937897 | 4.728 | 15.305 | -7.773 | 17.95 |
| 95.33283748605432 | 4.68 | 15.193 | -7.789 | 17.854 |
| 95.50018594272963 | 4.68 | 15.113 | -7.789 | 17.773 |
| 95.66753439940499 | 4.664 | 15.017 | -7.773 | 17.677 |
| 95.83488285608034 | 4.536 | 14.809 | -7.805 | 17.485 |
| 96.00223131275567 | 4.503 | 14.648 | -7.773 | 17.325 |
| 96.16957976943102 | 4.552 | 14.536 | -7.741 | 17.229 |
| 96.33692822610638 | 4.616 | 14.472 | -7.709 | 17.196 |
| 96.50427668278171 | 4.503 | 14.216 | -7.661 | 16.924 |
| 96.67162513945706 | 4.391 | 14.007 | -7.629 | 16.732 |
| 96.8389735961324 | 4.279 | 13.831 | -7.597 | 16.539 |
| 96.99702491632577 | 4.135 | 13.671 | -7.597 | 16.395 |
| 97.16437337300111 | 4.023 | 13.526 | -7.613 | 16.251 |
| 97.33172182967647 | 3.894 | 13.382 | -7.565 | 16.091 |
| 97.49907028635181 | 3.75 | 13.302 | -7.484 | 15.946 |
| 97.66641874302715 | 3.622 | 13.302 | -7.404 | 15.882 |
| 97.8337671997025 | 3.478 | 13.334 | -7.324 | 15.85 |
| 98.00111565637785 | 3.35 | 13.302 | -7.292 | 15.77 |
| 98.16846411305319 | 3.269 | 13.19 | -7.276 | 15.642 |
| 98.33581256972855 | 3.157 | 13.03 | -7.244 | 15.482 |
| 98.50316102640389 | 3.109 | 12.901 | -7.212 | 15.337 |
| 98.67050948307921 | 3.045 | 12.789 | -7.196 | 15.225 |
| 98.83785793975456 | 2.981 | 12.597 | -7.18 | 15.065 |
| 99.0052063964299 | 2.949 | 12.501 | -7.18 | 14.985 |
| 99.17255485310525 | 2.933 | 12.405 | -7.196 | 14.905 |
| 99.33060617329863 | 2.981 | 12.308 | -7.212 | 14.857 |
| 99.49795462997399 | 3.029 | 12.276 | -7.244 | 14.857 |
| 99.66530308664933 | 3.077 | 12.244 | -7.26 | 14.857 |
| 99.83265154332467 | 3.061 | 12.148 | -7.26 | 14.792 |
| 100.0 | 3.077 | 12.116 | -7.276 | 14.792 |